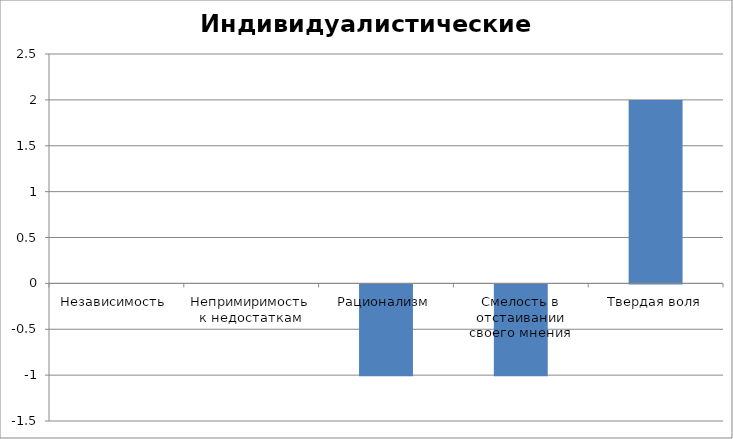
| Category | Индивидуалистические ценности |
|---|---|
| Независимость | 0 |
| Непримиримость к недостаткам | 0 |
| Рационализм | -1 |
| Смелость в отстаивании своего мнения | -1 |
| Твердая воля | 2 |